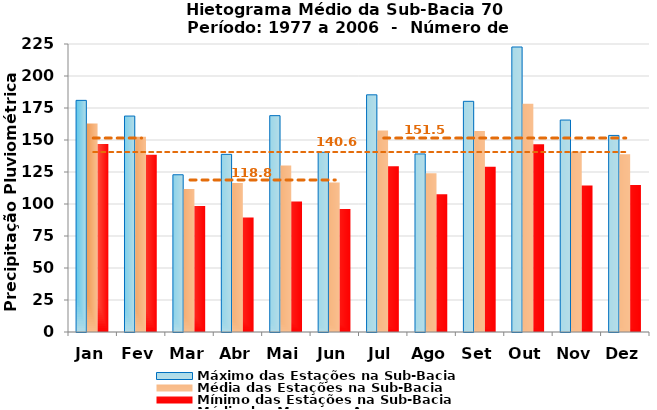
| Category | Máximo das Estações na Sub-Bacia | Média das Estações na Sub-Bacia | Mínimo das Estações na Sub-Bacia |
|---|---|---|---|
| Jan | 180.96 | 162.836 | 146.945 |
| Fev | 168.703 | 152.463 | 138.524 |
| Mar | 122.843 | 111.637 | 98.348 |
| Abr | 138.793 | 116.455 | 89.417 |
| Mai | 169.027 | 130.155 | 101.91 |
| Jun | 140.427 | 116.812 | 96.048 |
| Jul | 185.3 | 157.481 | 129.579 |
| Ago | 139.107 | 123.953 | 107.696 |
| Set | 180.223 | 157.126 | 129.083 |
| Out | 222.66 | 178.377 | 146.654 |
| Nov | 165.593 | 141.108 | 114.379 |
| Dez | 153.567 | 138.846 | 114.797 |